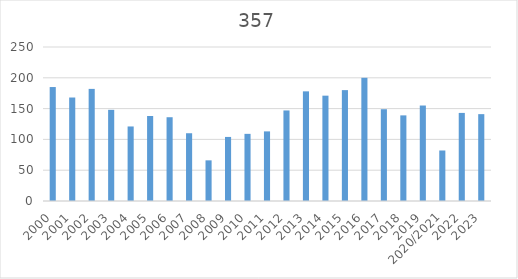
| Category | ""Antal starter ";Blad1!$B$4 |
|---|---|
| 2000 | 185 |
| 2001 | 168 |
| 2002 | 182 |
| 2003 | 148 |
| 2004 | 121 |
| 2005 | 138 |
| 2006 | 136 |
| 2007 | 110 |
| 2008 | 66 |
| 2009 | 104 |
| 2010 | 109 |
| 2011 | 113 |
| 2012 | 147 |
| 2013 | 178 |
| 2014 | 171 |
| 2015 | 180 |
| 2016 | 200 |
| 2017 | 149 |
| 2018 | 139 |
| 2019 | 155 |
| 2020/2021 | 82 |
| 2022 | 143 |
| 2023 | 141 |